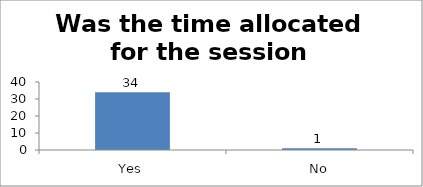
| Category | Was the time allocated for the session sufficient? |
|---|---|
| Yes | 34 |
| No | 1 |